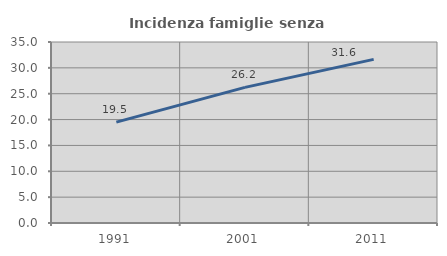
| Category | Incidenza famiglie senza nuclei |
|---|---|
| 1991.0 | 19.501 |
| 2001.0 | 26.221 |
| 2011.0 | 31.643 |